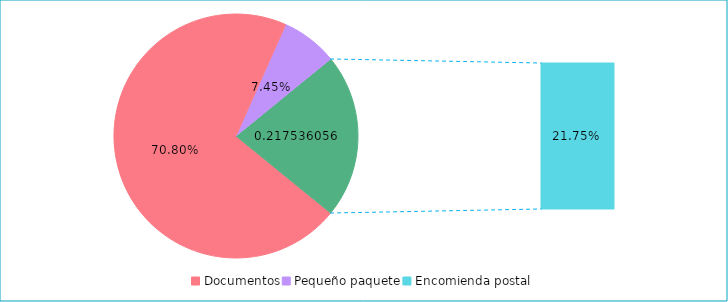
| Category | Series 0 |
|---|---|
| Documentos | 0.708 |
| Pequeño paquete | 0.074 |
| Encomienda postal | 0.218 |